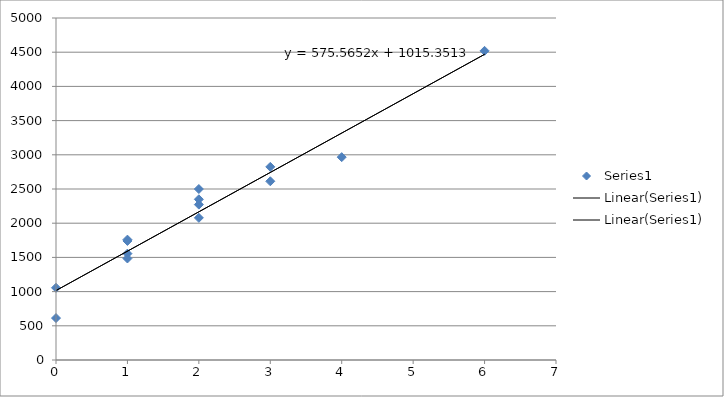
| Category | Series 0 |
|---|---|
| 0.0 | 1055.868 |
| 1.0 | 1759.78 |
| 0.0 | 613.203 |
| 1.0 | 1740.617 |
| 2.0 | 2499.559 |
| 1.0 | 1555.473 |
| 2.0 | 2349.375 |
| 1.0 | 1484.334 |
| 2.0 | 2271.941 |
| 2.0 | 2078.536 |
| 3.0 | 2823.553 |
| 3.0 | 2612.847 |
| 4.0 | 2965.731 |
| 6.0 | 4519.925 |